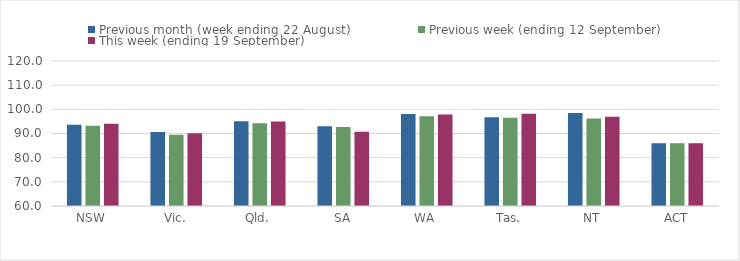
| Category | Previous month (week ending 22 August) | Previous week (ending 12 September) | This week (ending 19 September) |
|---|---|---|---|
| NSW | 93.66 | 93.23 | 94.06 |
| Vic. | 90.67 | 89.49 | 90.09 |
| Qld. | 95.11 | 94.19 | 94.96 |
| SA | 93.05 | 92.74 | 90.68 |
| WA | 98.11 | 97.1 | 97.89 |
| Tas. | 96.77 | 96.49 | 98.14 |
| NT | 98.45 | 96.24 | 96.93 |
| ACT | 85.97 | 85.97 | 85.97 |